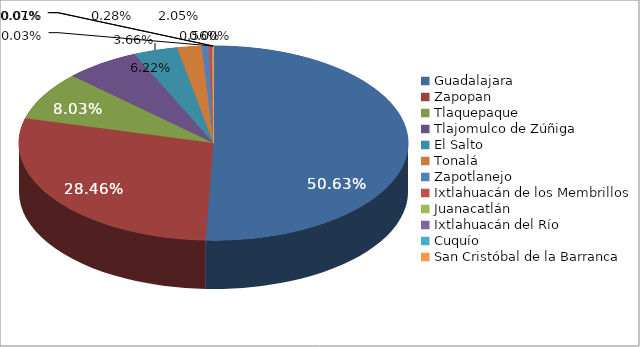
| Category | Series 0 |
|---|---|
| Guadalajara | 709209 |
| Zapopan | 398706 |
| Tlaquepaque | 112465 |
| Tlajomulco de Zúñiga | 87089 |
| El Salto | 51207 |
| Tonalá | 28671 |
| Zapotlanejo | 7793 |
| Ixtlahuacán de los Membrillos | 3856 |
| Juanacatlán | 1042 |
| Ixtlahuacán del Río | 488 |
| Cuquío | 177 |
| San Cristóbal de la Barranca | 27 |